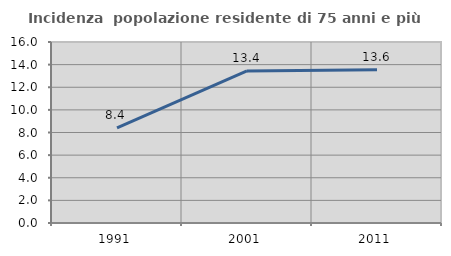
| Category | Incidenza  popolazione residente di 75 anni e più |
|---|---|
| 1991.0 | 8.419 |
| 2001.0 | 13.443 |
| 2011.0 | 13.552 |